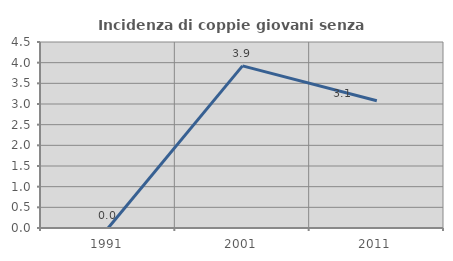
| Category | Incidenza di coppie giovani senza figli |
|---|---|
| 1991.0 | 0 |
| 2001.0 | 3.922 |
| 2011.0 | 3.077 |